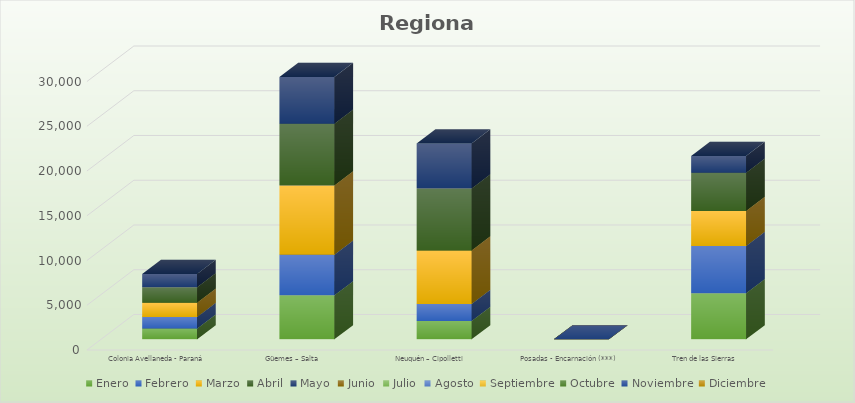
| Category | Enero | Febrero | Marzo | Abril | Mayo | Junio | Julio | Agosto | Septiembre | Octubre | Noviembre | Diciembre |
|---|---|---|---|---|---|---|---|---|---|---|---|---|
| Colonia Avellaneda - Paraná | 1204 | 1298 | 1578 | 1750 | 1479 |  |  |  |  |  |  |  |
| Güemes – Salta | 4916 | 4539 | 7745 | 6891 | 5237 |  |  |  |  |  |  |  |
| Neuquén – Cipolletti | 2047 | 1901 | 5975 | 6945 | 5011 |  |  |  |  |  |  |  |
| Posadas - Encarnación (***) | 0 | 0 | 0 | 0 | 0 |  |  |  |  |  |  |  |
| Tren de las Sierras | 5164 | 5258 | 3920 | 4283 | 1875 |  |  |  |  |  |  |  |